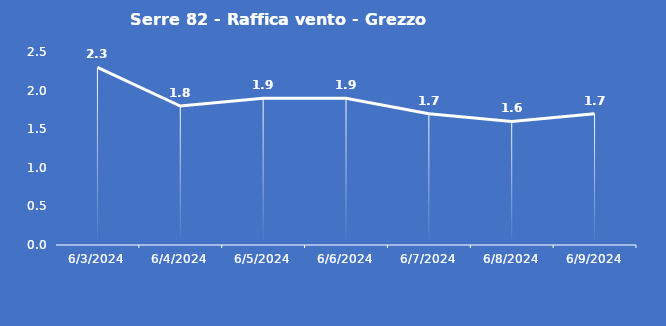
| Category | Serre 82 - Raffica vento - Grezzo (m/s) |
|---|---|
| 6/3/24 | 2.3 |
| 6/4/24 | 1.8 |
| 6/5/24 | 1.9 |
| 6/6/24 | 1.9 |
| 6/7/24 | 1.7 |
| 6/8/24 | 1.6 |
| 6/9/24 | 1.7 |